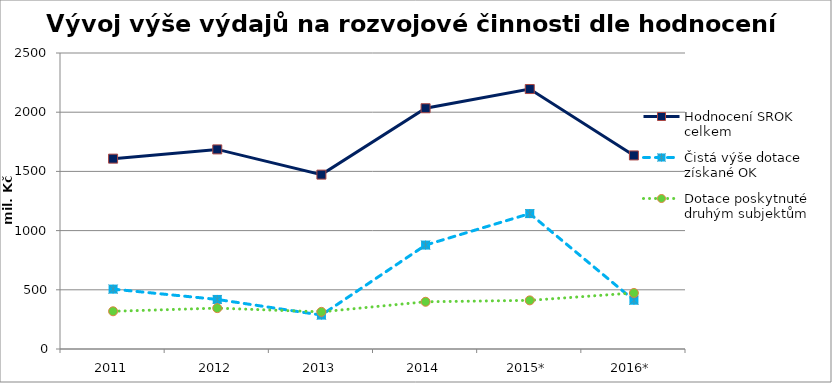
| Category | Hodnocení SROK celkem | Čistá výše dotace získané OK | Dotace poskytnuté druhým subjektům |
|---|---|---|---|
| 2011 | 1607638 | 505857 | 318555 |
| 2012 | 1685842 | 418589 | 345101 |
| 2013 | 1472887 | 286508 | 313709 |
| 2014 | 2033395 | 877745 | 398848 |
| 2015* | 2195630 | 1143591 | 410739 |
| 2016* | 1634844 | 411985 | 473283 |